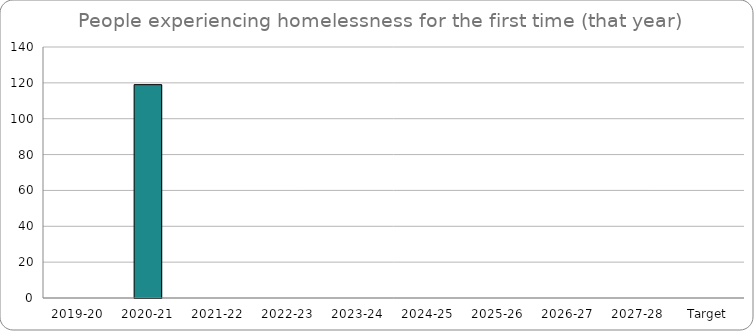
| Category | Series 0 |
|---|---|
| 2019-20 | 0 |
| 2020-21 | 119 |
| 2021-22 | 0 |
| 2022-23 | 0 |
| 2023-24 | 0 |
| 2024-25 | 0 |
| 2025-26 | 0 |
| 2026-27 | 0 |
| 2027-28 | 0 |
| Target | 0 |